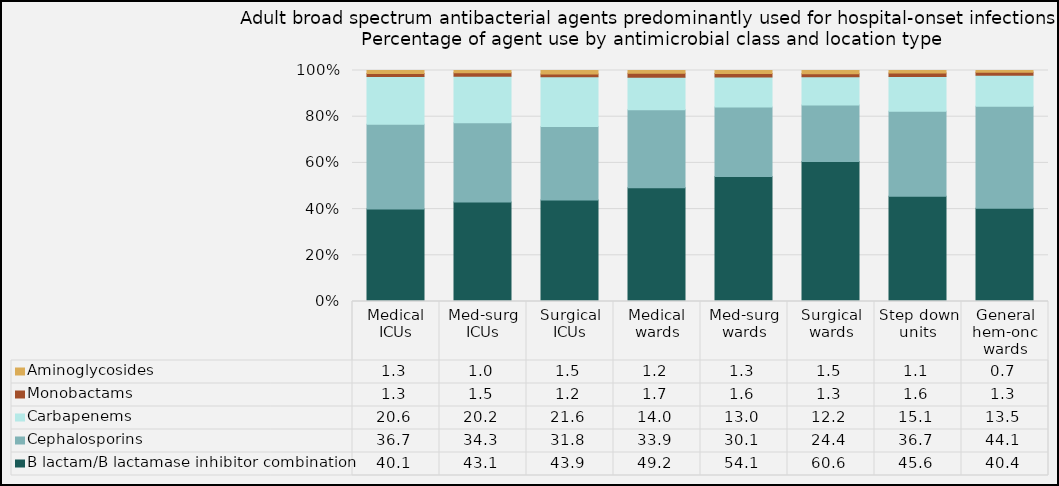
| Category | B lactam/B lactamase inhibitor combination | Cephalosporins | Carbapenems | Monobactams | Aminoglycosides |
|---|---|---|---|---|---|
| Medical ICUs | 40.05 | 36.71 | 20.62 | 1.28 | 1.33 |
| Med-surg ICUs | 43.08 | 34.25 | 20.19 | 1.53 | 0.95 |
| Surgical ICUs | 43.9 | 31.82 | 21.6 | 1.15 | 1.54 |
| Medical wards | 49.22 | 33.85 | 14 | 1.74 | 1.2 |
| Med-surg wards | 54.13 | 30.05 | 12.98 | 1.57 | 1.27 |
| Surgical wards | 60.63 | 24.4 | 12.21 | 1.29 | 1.46 |
| Step down units | 45.59 | 36.71 | 15.07 | 1.55 | 1.07 |
| General hem-onc wards | 40.41 | 44.06 | 13.49 | 1.32 | 0.72 |